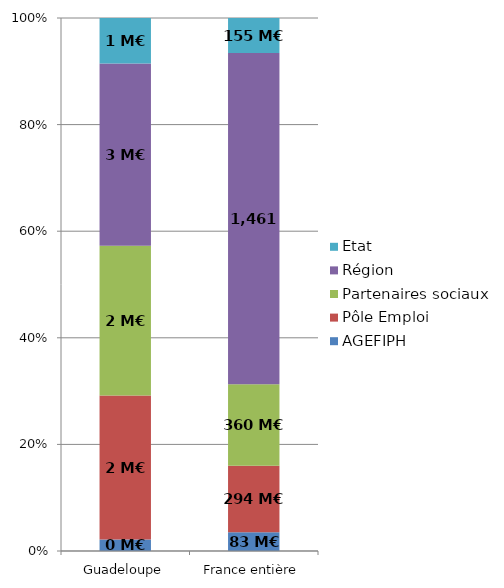
| Category | AGEFIPH | Pôle Emploi | Partenaires sociaux | Région | Etat |
|---|---|---|---|---|---|
| Guadeloupe | 0.165 | 2.088 | 2.169 | 2.64 | 0.661 |
| France entière | 82.716 | 293.959 | 359.593 | 1461.057 | 154.74 |